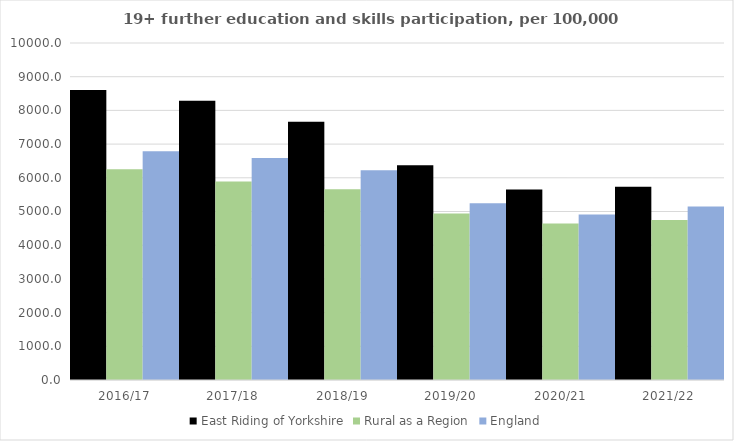
| Category | East Riding of Yorkshire | Rural as a Region | England |
|---|---|---|---|
| 2016/17 | 8606 | 6253.401 | 6788 |
| 2017/18 | 8287 | 5892.029 | 6588 |
| 2018/19 | 7665 | 5661.873 | 6227 |
| 2019/20 | 6374 | 4943.801 | 5244 |
| 2020/21 | 5650 | 4646.727 | 4913 |
| 2021/22 | 5732 | 4747.049 | 5151 |